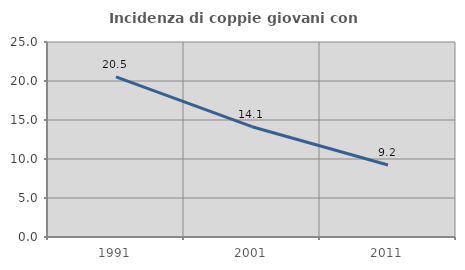
| Category | Incidenza di coppie giovani con figli |
|---|---|
| 1991.0 | 20.525 |
| 2001.0 | 14.14 |
| 2011.0 | 9.231 |